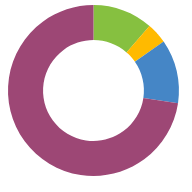
| Category | Активи |
|---|---|
| ПАРИЧНИ СРЕДСТВА | 43300 |
| СТОЙНОСТ | 15000 |
| ПЕНСИОНИРАНЕ | 46000 |
| ЛИЧНИ | 276500 |